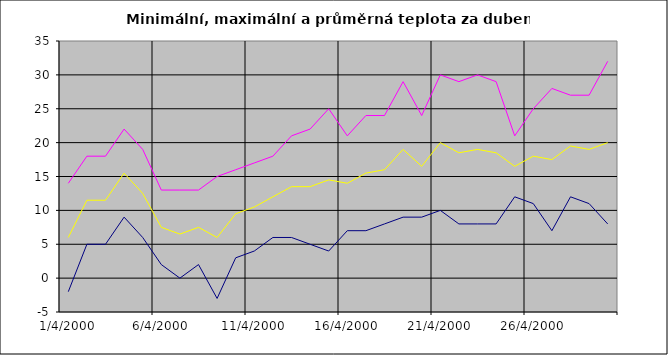
| Category | Series 0 | Series 1 | Series 2 |
|---|---|---|---|
| 2000-04-01 | -2 | 14 | 6 |
| 2000-04-02 | 5 | 18 | 11.5 |
| 2000-04-03 | 5 | 18 | 11.5 |
| 2000-04-04 | 9 | 22 | 15.5 |
| 2000-04-05 | 6 | 19 | 12.5 |
| 2000-04-06 | 2 | 13 | 7.5 |
| 2000-04-07 | 0 | 13 | 6.5 |
| 2000-04-08 | 2 | 13 | 7.5 |
| 2000-04-09 | -3 | 15 | 6 |
| 2000-04-10 | 3 | 16 | 9.5 |
| 2000-04-11 | 4 | 17 | 10.5 |
| 2000-04-12 | 6 | 18 | 12 |
| 2000-04-13 | 6 | 21 | 13.5 |
| 2000-04-14 | 5 | 22 | 13.5 |
| 2000-04-15 | 4 | 25 | 14.5 |
| 2000-04-16 | 7 | 21 | 14 |
| 2000-04-17 | 7 | 24 | 15.5 |
| 2000-04-18 | 8 | 24 | 16 |
| 2000-04-19 | 9 | 29 | 19 |
| 2000-04-20 | 9 | 24 | 16.5 |
| 2000-04-21 | 10 | 30 | 20 |
| 2000-04-22 | 8 | 29 | 18.5 |
| 2000-04-23 | 8 | 30 | 19 |
| 2000-04-24 | 8 | 29 | 18.5 |
| 2000-04-25 | 12 | 21 | 16.5 |
| 2000-04-26 | 11 | 25 | 18 |
| 2000-04-27 | 7 | 28 | 17.5 |
| 2000-04-28 | 12 | 27 | 19.5 |
| 2000-04-29 | 11 | 27 | 19 |
| 2000-04-30 | 8 | 32 | 20 |